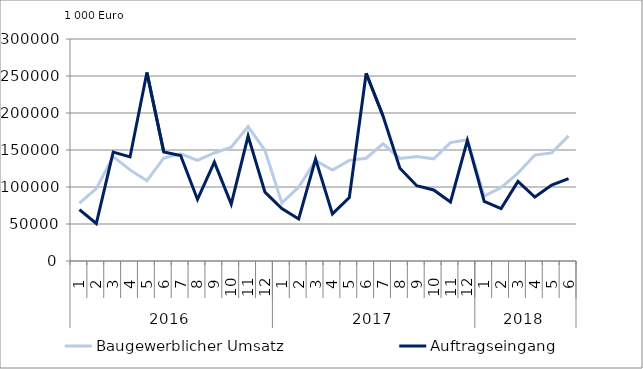
| Category | Baugewerblicher Umsatz | Auftragseingang |
|---|---|---|
| 0 | 78291.738 | 69470.357 |
| 1 | 97863.379 | 50640.033 |
| 2 | 141176.119 | 147206.65 |
| 3 | 123121.297 | 140579.009 |
| 4 | 108561.124 | 254739.334 |
| 5 | 139030.209 | 147481.644 |
| 6 | 144784.416 | 142609.658 |
| 7 | 135870.195 | 83192.156 |
| 8 | 145961.738 | 133594.351 |
| 9 | 153886.826 | 76793.838 |
| 10 | 181740.037 | 168867.568 |
| 11 | 149348.138 | 93011.853 |
| 12 | 78446.78 | 70908.903 |
| 13 | 99841.908 | 56868.408 |
| 14 | 135679.867 | 137790.423 |
| 15 | 123004.403 | 63637.761 |
| 16 | 136010.071 | 85644.63 |
| 17 | 138859.308 | 253791.552 |
| 18 | 158353.879 | 196034.198 |
| 19 | 138510.315 | 125319.873 |
| 20 | 141109.925 | 101690.626 |
| 21 | 138067.098 | 95966.626 |
| 22 | 160064.454 | 79701.993 |
| 23 | 163969.017 | 162878.607 |
| 24 | 87640.529 | 80684.627 |
| 25 | 99259.455 | 70746.763 |
| 26 | 118764.324 | 107538.747 |
| 27 | 143144.178 | 86374.619 |
| 28 | 146070.782 | 102661.329 |
| 29 | 169150.753 | 111287.709 |